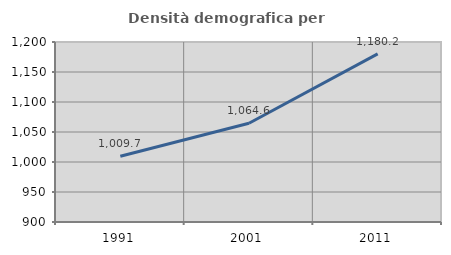
| Category | Densità demografica |
|---|---|
| 1991.0 | 1009.673 |
| 2001.0 | 1064.639 |
| 2011.0 | 1180.202 |